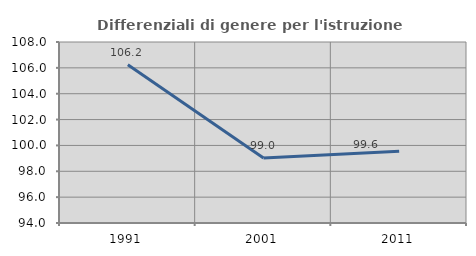
| Category | Differenziali di genere per l'istruzione superiore |
|---|---|
| 1991.0 | 106.236 |
| 2001.0 | 99.02 |
| 2011.0 | 99.555 |